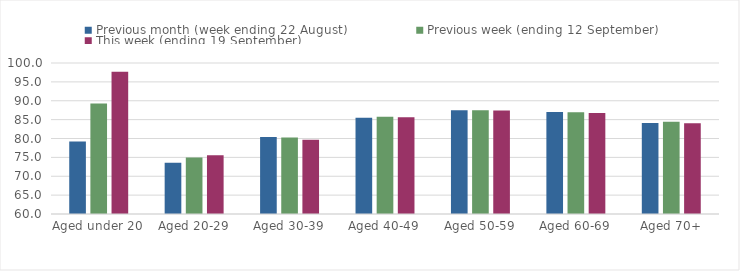
| Category | Previous month (week ending 22 August) | Previous week (ending 12 September) | This week (ending 19 September) |
|---|---|---|---|
| Aged under 20 | 79.19 | 89.24 | 97.66 |
| Aged 20-29 | 73.57 | 74.94 | 75.55 |
| Aged 30-39 | 80.37 | 80.26 | 79.7 |
| Aged 40-49 | 85.48 | 85.76 | 85.65 |
| Aged 50-59 | 87.47 | 87.46 | 87.43 |
| Aged 60-69 | 86.99 | 86.94 | 86.76 |
| Aged 70+ | 84.09 | 84.42 | 84.05 |